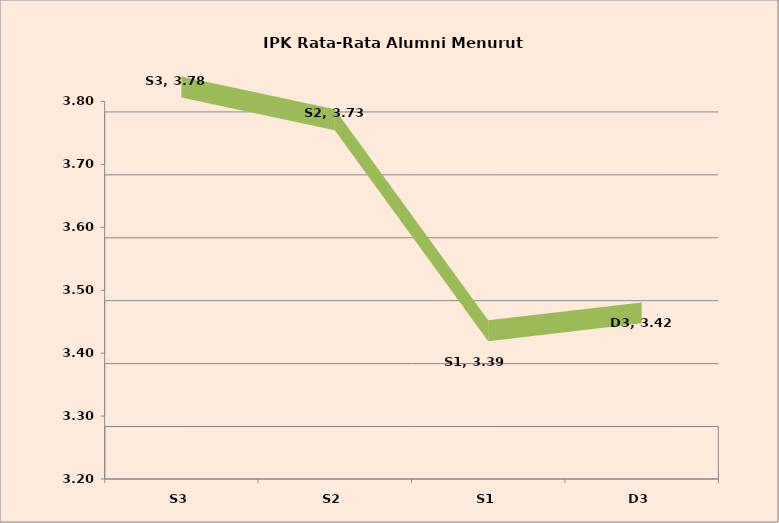
| Category | Series 0 |
|---|---|
| S3 | 3.78 |
| S2 | 3.728 |
| S1 | 3.393 |
| D3 | 3.421 |